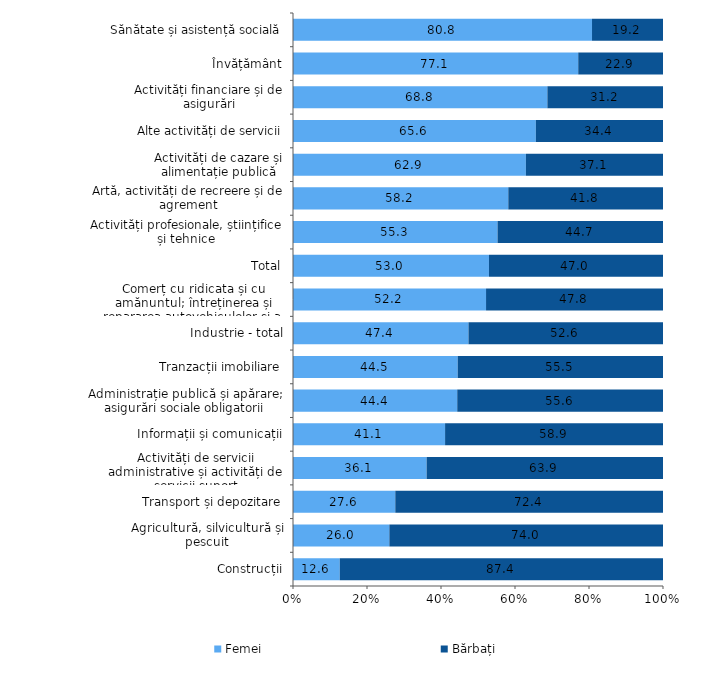
| Category | Femei | Bărbați |
|---|---|---|
| Construcții | 12.642 | 87.358 |
| Agricultură, silvicultură și pescuit | 26.042 | 73.958 |
| Transport și depozitare | 27.647 | 72.352 |
| Activități de servicii administrative și activități de servicii suport | 36.114 | 63.885 |
| Informații și comunicații | 41.104 | 58.896 |
| Administrație publică și apărare; asigurări sociale obligatorii | 44.391 | 55.609 |
| Tranzacții imobiliare | 44.518 | 55.482 |
| Industrie - total | 47.43 | 52.57 |
| Comerț cu ridicata și cu amănuntul; întreținerea și repararea autovehiculelor și a motocicletelor | 52.176 | 47.824 |
| Total | 52.963 | 47.037 |
| Activități profesionale, științifice și tehnice | 55.286 | 44.714 |
| Artă, activități de recreere și de agrement | 58.193 | 41.807 |
| Activități de cazare și alimentație publică | 62.948 | 37.053 |
| Alte activități de servicii | 65.638 | 34.362 |
| Activități financiare și de asigurări | 68.755 | 31.245 |
| Învățământ | 77.092 | 22.908 |
| Sănătate și asistență socială | 80.816 | 19.184 |